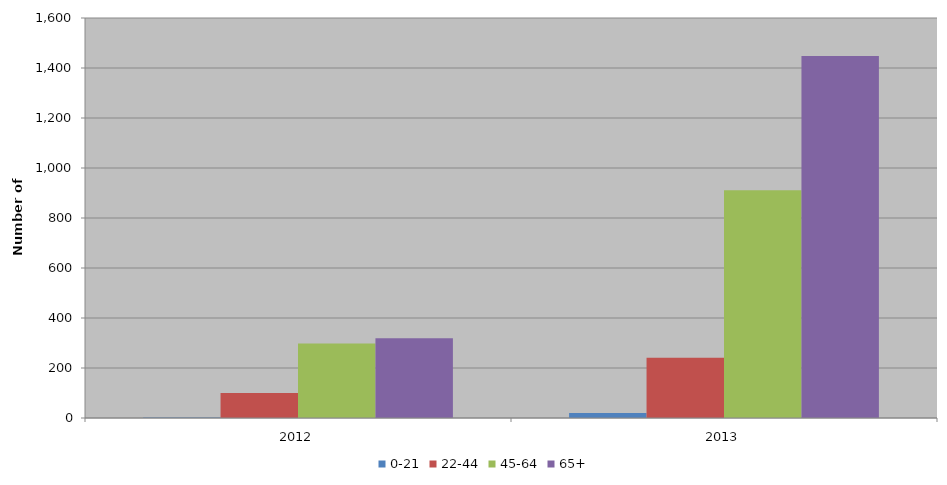
| Category | 0-21 | 22-44 | 45-64 | 65+ |
|---|---|---|---|---|
| 2012 | 2 | 100 | 298 | 319 |
| 2013 | 20 | 241 | 911 | 1448 |